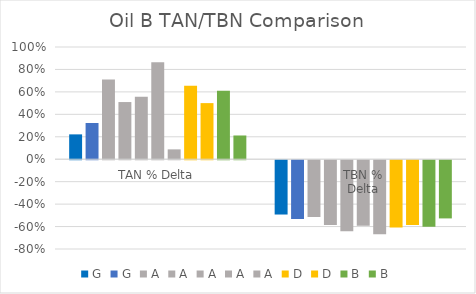
| Category | G | A | D | B |
|---|---|---|---|---|
| TAN % Delta | 0.323 | 0.088 | 0.5 | 0.212 |
| TBN %
Delta | -0.524 | -0.66 | -0.577 | -0.519 |